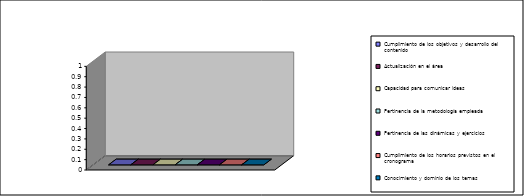
| Category | Cumplimiento de los objetivos y desarrollo del contenido  | Actualización en el área | Capacidad para comunicar ideas | Pertinencia de la metodología empleada | Pertinencia de las dinámicas y ejercicios | Cumplimiento de los horarios previstos en el cronograma | Conocimiento y dominio de los temas |
|---|---|---|---|---|---|---|---|
| 0 | 0 | 0 | 0 | 0 | 0 | 0 | 0 |